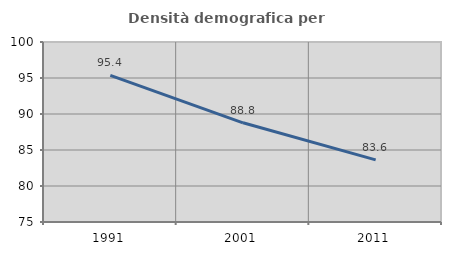
| Category | Densità demografica |
|---|---|
| 1991.0 | 95.36 |
| 2001.0 | 88.778 |
| 2011.0 | 83.631 |